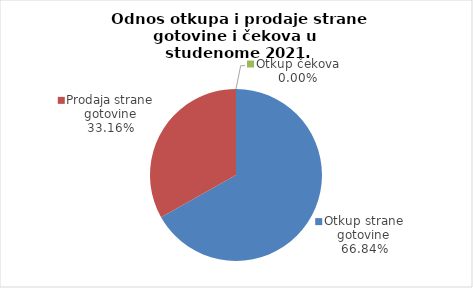
| Category | Series 0 |
|---|---|
| Otkup strane gotovine | 66.838 |
| Prodaja strane gotovine | 33.162 |
| Otkup čekova | 0 |